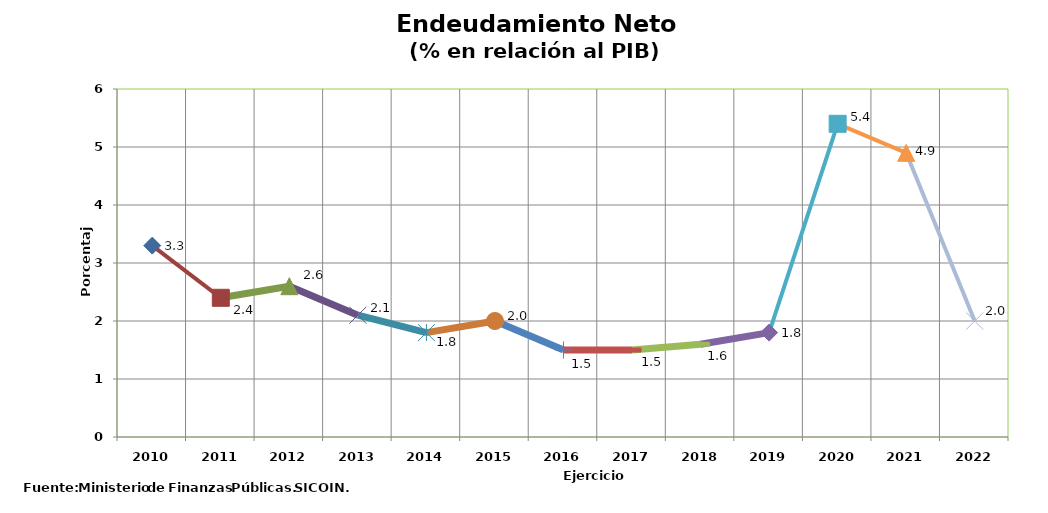
| Category | Series 1 |
|---|---|
| 2010 | 3.3 |
| 2011 | 2.4 |
| 2012 | 2.6 |
| 2013 | 2.1 |
| 2014 | 1.8 |
| 2015 | 2 |
| 2016 | 1.5 |
| 2017 | 1.5 |
| 2018 | 1.6 |
| 2019 | 1.8 |
| 2020 | 5.4 |
| 2021 | 4.9 |
| 2022 | 2 |